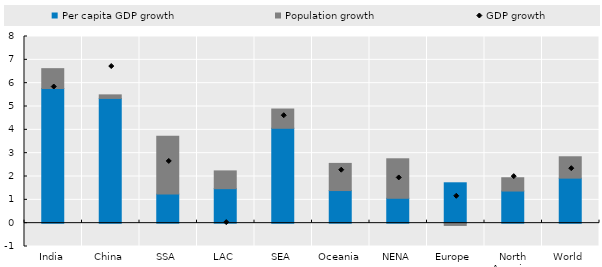
| Category | Per capita GDP growth | Population growth |
|---|---|---|
| India | 5.772 | 0.85 |
| China | 5.346 | 0.152 |
| SSA | 1.246 | 2.485 |
| LAC | 1.479 | 0.761 |
| SEA | 4.066 | 0.826 |
| Oceania | 1.398 | 1.164 |
| NENA | 1.067 | 1.693 |
| Europe | 1.731 | -0.097 |
| North America | 1.377 | 0.57 |
| World | 1.93 | 0.915 |